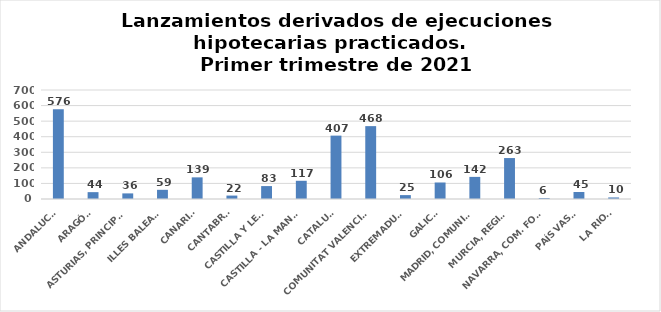
| Category | 616 |
|---|---|
| ANDALUCÍA | 576 |
| ARAGÓN | 44 |
| ASTURIAS, PRINCIPADO | 36 |
| ILLES BALEARS | 59 |
| CANARIAS | 139 |
| CANTABRIA | 22 |
| CASTILLA Y LEÓN | 83 |
| CASTILLA - LA MANCHA | 117 |
| CATALUÑA | 407 |
| COMUNITAT VALENCIANA | 468 |
| EXTREMADURA | 25 |
| GALICIA | 106 |
| MADRID, COMUNIDAD | 142 |
| MURCIA, REGIÓN | 263 |
| NAVARRA, COM. FORAL | 6 |
| PAÍS VASCO | 45 |
| LA RIOJA | 10 |